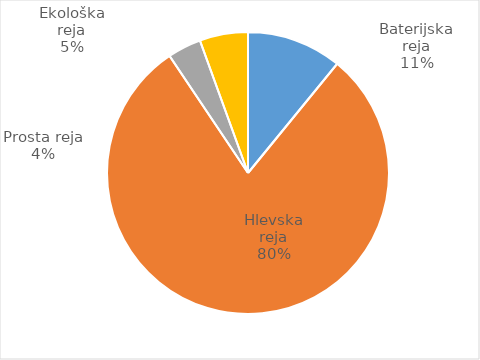
| Category | Količina kosov jajc |
|---|---|
| Baterijska reja | 336070 |
| Hlevska reja | 2458034 |
| Prosta reja | 118965 |
| Ekološka reja | 170880 |